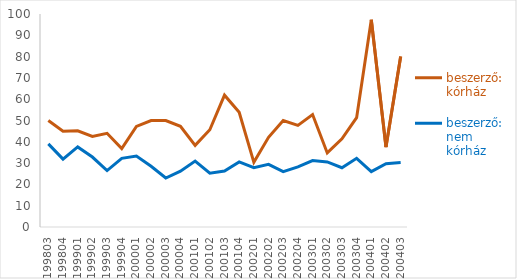
| Category | beszerző: kórház | beszerző: nem kórház |
|---|---|---|
| 199803.0 | 50 | 39.02 |
| 199804.0 | 44.94 | 31.87 |
| 199901.0 | 45.16 | 37.58 |
| 199902.0 | 42.55 | 32.84 |
| 199903.0 | 44 | 26.51 |
| 199904.0 | 36.84 | 32.23 |
| 200001.0 | 47.22 | 33.28 |
| 200002.0 | 50 | 28.54 |
| 200003.0 | 50 | 22.99 |
| 200004.0 | 47.27 | 26.2 |
| 200101.0 | 38.33 | 30.98 |
| 200102.0 | 45.65 | 25.26 |
| 200103.0 | 61.9 | 26.29 |
| 200104.0 | 53.85 | 30.55 |
| 200201.0 | 30.36 | 27.89 |
| 200202.0 | 42.11 | 29.39 |
| 200203.0 | 50 | 25.99 |
| 200204.0 | 47.73 | 28.26 |
| 200301.0 | 52.78 | 31.18 |
| 200302.0 | 34.78 | 30.54 |
| 200303.0 | 41.38 | 27.83 |
| 200304.0 | 51.35 | 32.24 |
| 200401.0 | 97.3 | 26.03 |
| 200402.0 | 37.5 | 29.75 |
| 200403.0 | 80 | 30.26 |